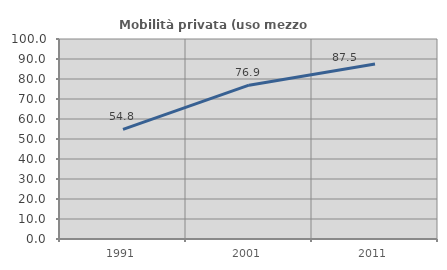
| Category | Mobilità privata (uso mezzo privato) |
|---|---|
| 1991.0 | 54.795 |
| 2001.0 | 76.923 |
| 2011.0 | 87.5 |